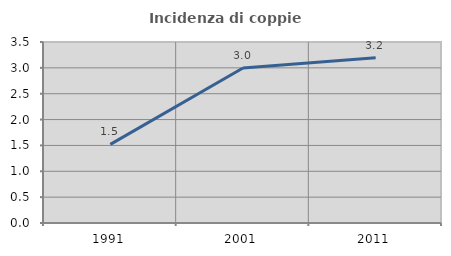
| Category | Incidenza di coppie miste |
|---|---|
| 1991.0 | 1.52 |
| 2001.0 | 2.996 |
| 2011.0 | 3.197 |